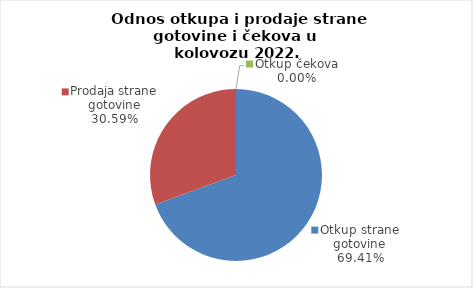
| Category | Series 0 |
|---|---|
| Otkup strane gotovine | 69.415 |
| Prodaja strane gotovine | 30.585 |
| Otkup čekova | 0 |